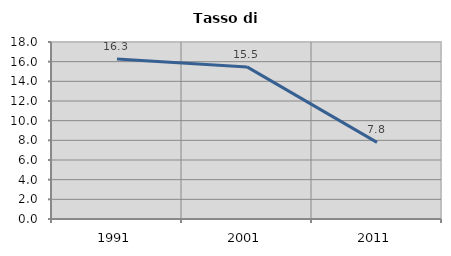
| Category | Tasso di disoccupazione   |
|---|---|
| 1991.0 | 16.276 |
| 2001.0 | 15.468 |
| 2011.0 | 7.796 |